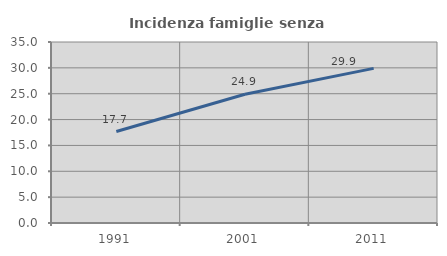
| Category | Incidenza famiglie senza nuclei |
|---|---|
| 1991.0 | 17.682 |
| 2001.0 | 24.885 |
| 2011.0 | 29.905 |